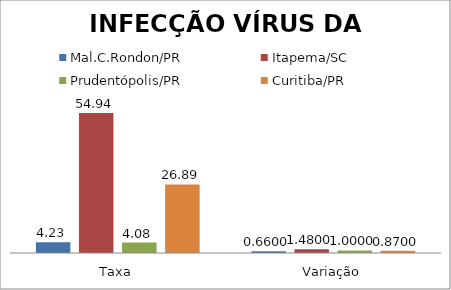
| Category | Mal.C.Rondon/PR | Itapema/SC | Prudentópolis/PR | Toledo/PR | Cascavel/PR | Curitiba/PR |
|---|---|---|---|---|---|---|
| Taxa | 4.23 | 54.94 | 4.08 |  |  | 26.89 |
| Variação | 0.66 | 1.48 | 1 |  |  | 0.87 |